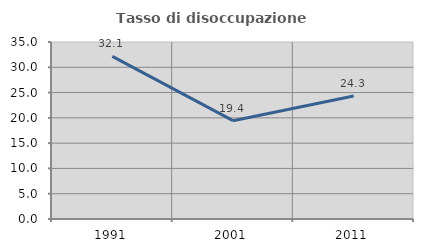
| Category | Tasso di disoccupazione giovanile  |
|---|---|
| 1991.0 | 32.143 |
| 2001.0 | 19.444 |
| 2011.0 | 24.324 |